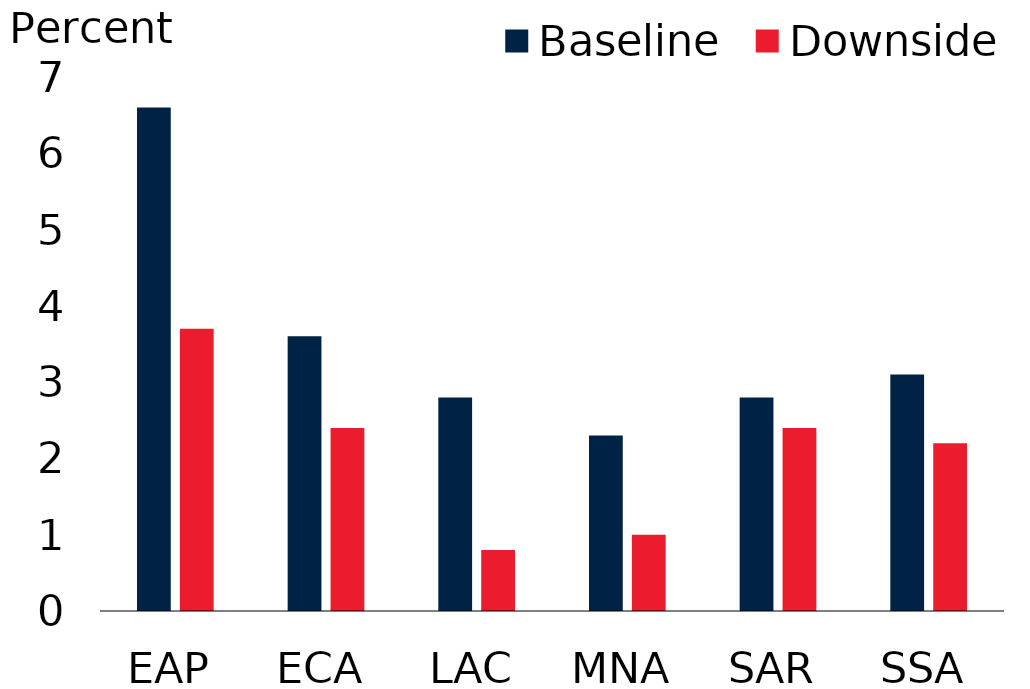
| Category | Baseline | Downside |
|---|---|---|
| EAP | 6.6 | 3.7 |
| ECA | 3.6 | 2.4 |
| LAC | 2.8 | 0.8 |
| MNA | 2.3 | 1 |
| SAR | 2.8 | 2.4 |
| SSA | 3.1 | 2.2 |